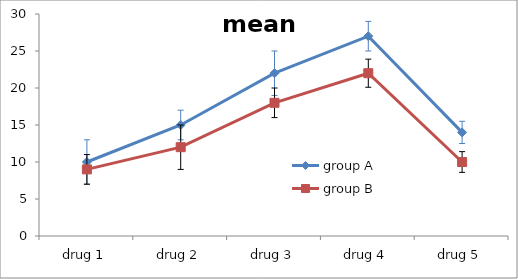
| Category | group A | group B |
|---|---|---|
| drug 1 | 10 | 9 |
| drug 2 | 15 | 12 |
| drug 3 | 22 | 18 |
| drug 4 | 27 | 22 |
| drug 5 | 14 | 10 |